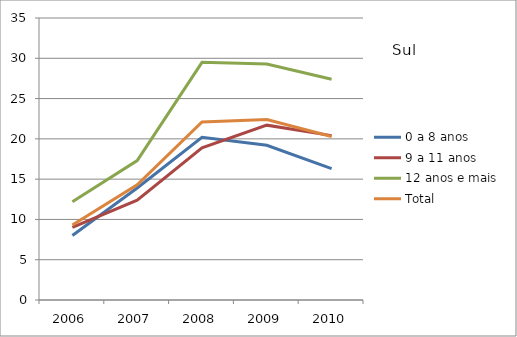
| Category | 0 a 8 anos | 9 a 11 anos | 12 anos e mais | Total |
|---|---|---|---|---|
| 2006.0 | 8 | 9 | 12.2 | 9.3 |
| 2007.0 | 13.9 | 12.4 | 17.3 | 14.3 |
| 2008.0 | 20.2 | 18.9 | 29.5 | 22.1 |
| 2009.0 | 19.2 | 21.7 | 29.3 | 22.4 |
| 2010.0 | 16.3 | 20.4 | 27.4 | 20.3 |